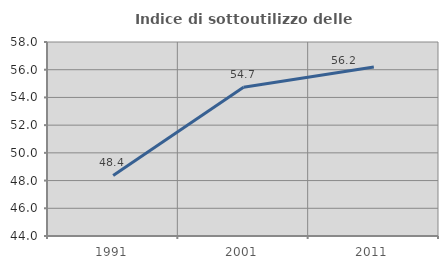
| Category | Indice di sottoutilizzo delle abitazioni  |
|---|---|
| 1991.0 | 48.369 |
| 2001.0 | 54.733 |
| 2011.0 | 56.19 |